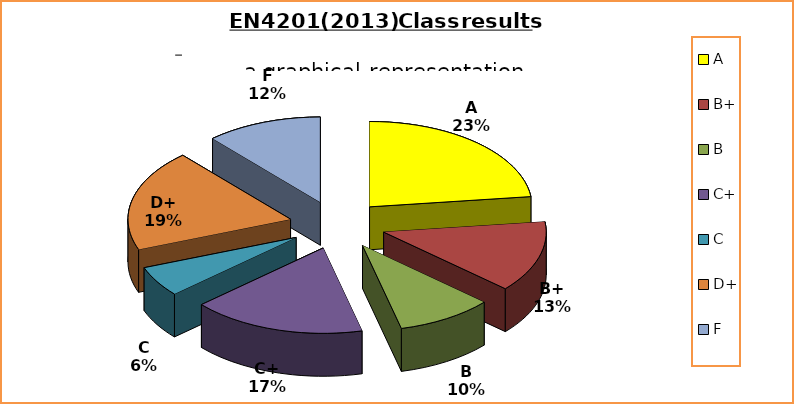
| Category | Series 0 |
|---|---|
| A | 12 |
| B+ | 7 |
| B | 5 |
| C+ | 9 |
| C | 3 |
| D+ | 10 |
| F | 6 |